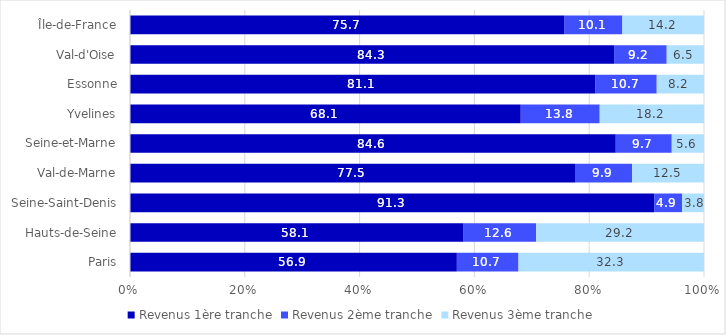
| Category | Revenus |
|---|---|
| Paris | 32.312 |
| Hauts-de-Seine | 29.247 |
| Seine-Saint-Denis | 3.823 |
| Val-de-Marne | 12.529 |
| Seine-et-Marne | 5.619 |
| Yvelines | 18.169 |
| Essonne | 8.232 |
| Val-d'Oise | 6.493 |
| Île-de-France | 14.221 |